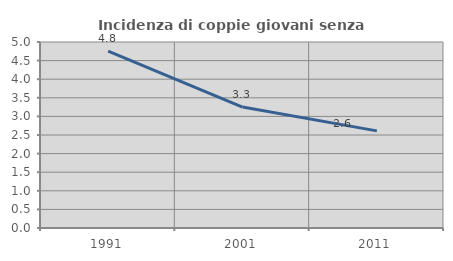
| Category | Incidenza di coppie giovani senza figli |
|---|---|
| 1991.0 | 4.754 |
| 2001.0 | 3.251 |
| 2011.0 | 2.611 |